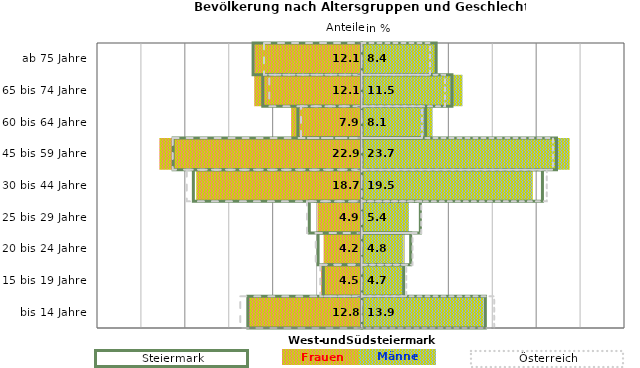
| Category | Frauen | Männer | Frauen Spalte2 | Männer Spalte2 | Frauen Spalte3 | Männer Spalte3 |
|---|---|---|---|---|---|---|
| bis 14 Jahre | -12.8 | 13.9 | 14.1 | -13 | -13.8 | 15.1 |
| 15 bis 19 Jahre | -4.5 | 4.7 | 4.8 | -4.4 | -4.7 | 5.1 |
| 20 bis 24 Jahre | -4.2 | 4.8 | 5.6 | -5 | -5.2 | 5.8 |
| 25 bis 29 Jahre | -4.9 | 5.4 | 6.7 | -6 | -6.2 | 6.8 |
| 30 bis 44 Jahre | -18.7 | 19.5 | 20.6 | -19.2 | -19.9 | 21.1 |
| 45 bis 59 Jahre | -22.9 | 23.7 | 22.2 | -21.5 | -21.5 | 21.8 |
| 60 bis 64 Jahre | -7.9 | 8.1 | 7.3 | -7.3 | -6.9 | 6.9 |
| 65 bis 74 Jahre | -12.1 | 11.5 | 10.3 | -11.3 | -10.5 | 9.5 |
| ab 75 Jahre | -12.1 | 8.4 | 8.5 | -12.4 | -11.1 | 7.8 |